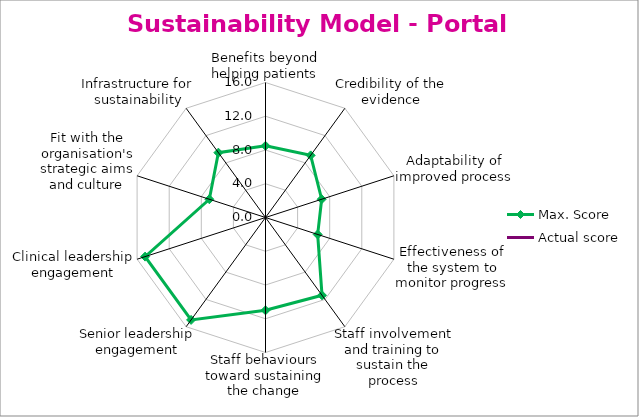
| Category | Max. Score | Actual score |
|---|---|---|
| Benefits beyond helping patients | 8.5 | 0 |
| Credibility of the evidence | 9.1 | 0 |
| Adaptability of improved process | 7 | 0 |
| Effectiveness of the system to monitor progress | 6.5 | 0 |
| Staff involvement and training to sustain the process | 11.4 | 0 |
| Staff behaviours toward sustaining the change | 11 | 0 |
| Senior leadership engagement | 15 | 0 |
| Clinical leadership engagement | 15 | 0 |
| Fit with the organisation's strategic aims and culture | 7 | 0 |
| Infrastructure for sustainability | 9.5 | 0 |